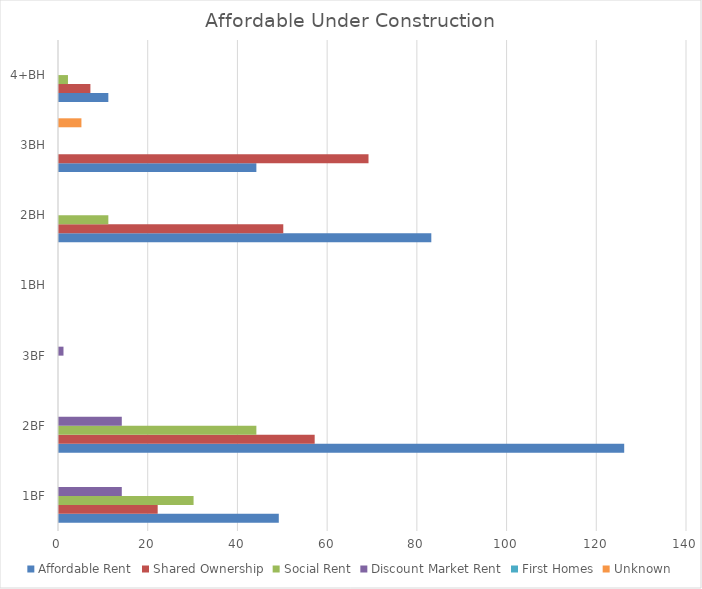
| Category | Affordable Rent | Shared Ownership | Social Rent | Discount Market Rent | First Homes | Unknown |
|---|---|---|---|---|---|---|
| 1BF | 49 | 22 | 30 | 14 | 0 | 0 |
| 2BF | 126 | 57 | 44 | 14 | 0 | 0 |
| 3BF | 0 | 0 | 0 | 1 | 0 | 0 |
| 1BH | 0 | 0 | 0 | 0 | 0 | 0 |
| 2BH | 83 | 50 | 11 | 0 | 0 | 0 |
| 3BH | 44 | 69 | 0 | 0 | 0 | 5 |
| 4+BH | 11 | 7 | 2 | 0 | 0 | 0 |